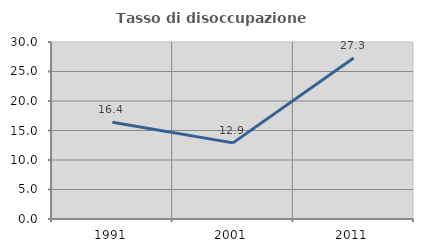
| Category | Tasso di disoccupazione giovanile  |
|---|---|
| 1991.0 | 16.393 |
| 2001.0 | 12.903 |
| 2011.0 | 27.273 |